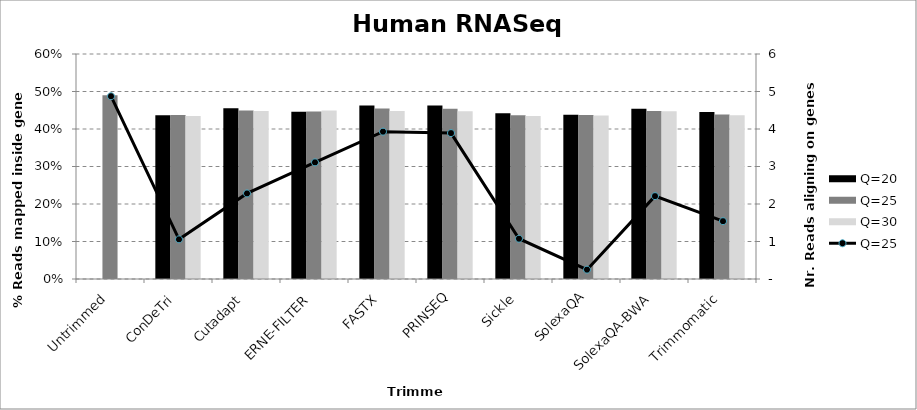
| Category | Q=20 | Q=25 | Q=30 |
|---|---|---|---|
| Untrimmed | 0 | 0.49 | 0 |
| ConDeTri | 0.437 | 0.437 | 0.434 |
| Cutadapt | 0.455 | 0.449 | 0.448 |
| ERNE-FILTER | 0.446 | 0.447 | 0.45 |
| FASTX | 0.463 | 0.454 | 0.448 |
| PRINSEQ | 0.463 | 0.454 | 0.448 |
| Sickle | 0.442 | 0.436 | 0.435 |
| SolexaQA | 0.438 | 0.437 | 0.436 |
| SolexaQA-BWA | 0.454 | 0.448 | 0.447 |
| Trimmomatic | 0.445 | 0.438 | 0.436 |